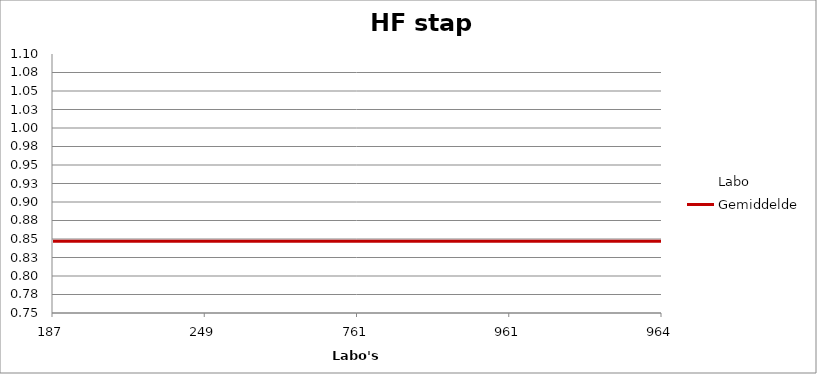
| Category | Labo | Gemiddelde |
|---|---|---|
| 187.0 | 1.158 | 0.847 |
| 249.0 | 0.899 | 0.847 |
| 761.0 | 0.814 | 0.847 |
| 961.0 | 0.803 | 0.847 |
| 964.0 | 0.871 | 0.847 |